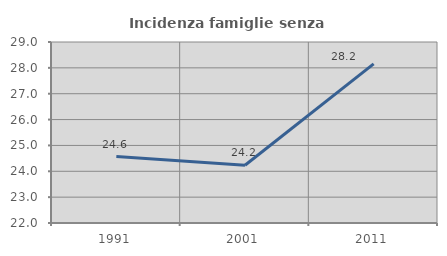
| Category | Incidenza famiglie senza nuclei |
|---|---|
| 1991.0 | 24.568 |
| 2001.0 | 24.233 |
| 2011.0 | 28.152 |